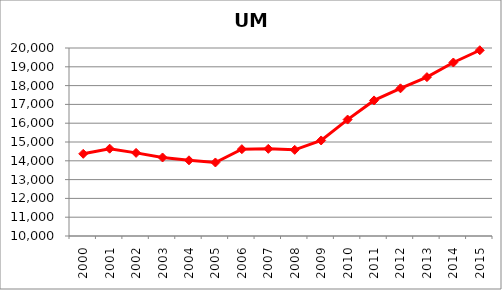
| Category | Series 0 |
|---|---|
| 2000.0 | 14370.908 |
| 2001.0 | 14644.367 |
| 2002.0 | 14421.042 |
| 2003.0 | 14177.058 |
| 2004.0 | 14026.525 |
| 2005.0 | 13911.15 |
| 2006.0 | 14619.2 |
| 2007.0 | 14636.8 |
| 2008.0 | 14582.025 |
| 2009.0 | 15081.867 |
| 2010.0 | 16192.75 |
| 2011.0 | 17211.958 |
| 2012.0 | 17854.117 |
| 2013.0 | 18450.475 |
| 2014.0 | 19229.383 |
| 2015.0 | 19880.558 |